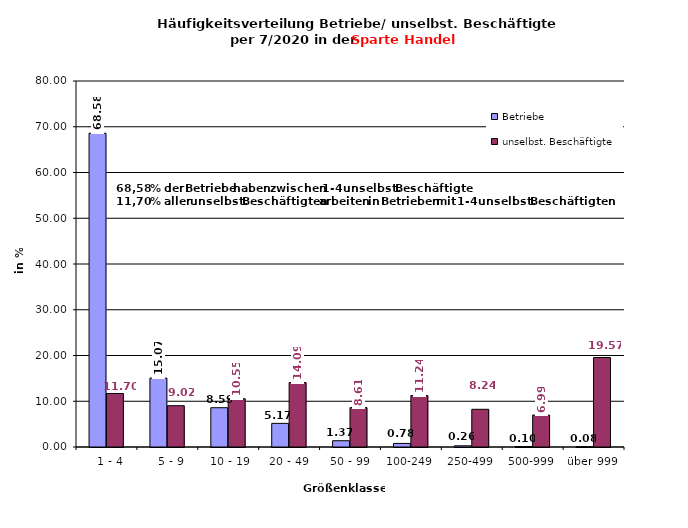
| Category | Betriebe | unselbst. Beschäftigte |
|---|---|---|
|   1 - 4 | 68.578 | 11.7 |
|   5 - 9 | 15.072 | 9.021 |
|  10 - 19 | 8.586 | 10.546 |
| 20 - 49 | 5.166 | 14.088 |
| 50 - 99 | 1.37 | 8.61 |
| 100-249 | 0.781 | 11.244 |
| 250-499 | 0.264 | 8.24 |
| 500-999 | 0.101 | 6.986 |
| über 999 | 0.081 | 19.566 |